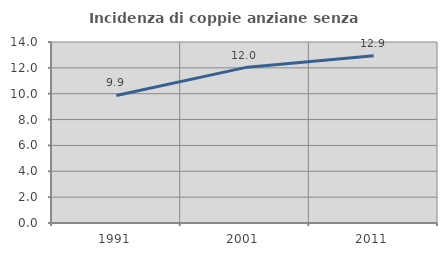
| Category | Incidenza di coppie anziane senza figli  |
|---|---|
| 1991.0 | 9.865 |
| 2001.0 | 12.019 |
| 2011.0 | 12.941 |